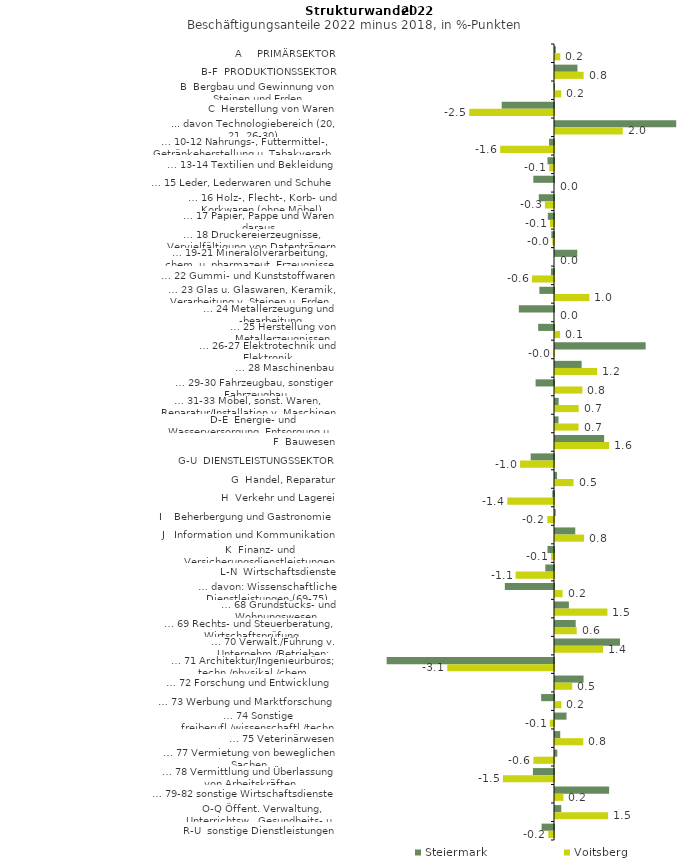
| Category | Steiermark | Voitsberg |
|---|---|---|
| A     PRIMÄRSEKTOR | 0.025 | 0.153 |
| B-F  PRODUKTIONSSEKTOR | 0.65 | 0.83 |
| B  Bergbau und Gewinnung von Steinen und Erden | -0.011 | 0.182 |
| C  Herstellung von Waren | -1.516 | -2.456 |
| ... davon Technologiebereich (20, 21, 26-30) | 3.513 | 1.964 |
| … 10-12 Nahrungs-, Futtermittel-, Getränkeherstellung u. Tabakverarb. | -0.143 | -1.558 |
| … 13-14 Textilien und Bekleidung | -0.189 | -0.138 |
| … 15 Leder, Lederwaren und Schuhe | -0.6 | 0 |
| … 16 Holz-, Flecht-, Korb- und Korkwaren (ohne Möbel)  | -0.44 | -0.264 |
| … 17 Papier, Pappe und Waren daraus  | -0.178 | -0.116 |
| … 18 Druckereierzeugnisse, Vervielfältigung von Datenträgern | -0.077 | -0.048 |
| … 19-21 Mineralölverarbeitung, chem. u. pharmazeut. Erzeugnisse | 0.646 | 0 |
| … 22 Gummi- und Kunststoffwaren | -0.089 | -0.637 |
| … 23 Glas u. Glaswaren, Keramik, Verarbeitung v. Steinen u. Erden  | -0.424 | 0.997 |
| … 24 Metallerzeugung und -bearbeitung | -1.019 | 0 |
| … 25 Herstellung von Metallerzeugnissen  | -0.459 | 0.149 |
| … 26-27 Elektrotechnik und Elektronik | 2.628 | -0.017 |
| … 28 Maschinenbau | 0.773 | 1.219 |
| … 29-30 Fahrzeugbau, sonstiger Fahrzeugbau | -0.534 | 0.795 |
| … 31-33 Möbel, sonst. Waren, Reparatur/Installation v. Maschinen | 0.106 | 0.688 |
| D-E  Energie- und Wasserversorgung, Entsorgung u. Rückgewinnung | 0.102 | 0.683 |
| F  Bauwesen | 1.424 | 1.57 |
| G-U  DIENSTLEISTUNGSSEKTOR | -0.676 | -0.983 |
| G  Handel, Reparatur | 0.059 | 0.539 |
| H  Verkehr und Lagerei | -0.05 | -1.353 |
| I    Beherbergung und Gastronomie | 0.02 | -0.195 |
| J   Information und Kommunikation | 0.588 | 0.843 |
| K  Finanz- und Versicherungsdienstleistungen | -0.188 | -0.082 |
| L-N  Wirtschaftsdienste | -0.252 | -1.112 |
| … davon: Wissenschaftliche Dienstleistungen (69-75) | -1.425 | 0.219 |
| … 68 Grundstücks- und Wohnungswesen  | 0.402 | 1.519 |
| … 69 Rechts- und Steuerberatung, Wirtschaftsprüfung | 0.6 | 0.628 |
| … 70 Verwalt./Führung v. Unternehm./Betrieben; Unternehmensberat. | 1.883 | 1.393 |
| … 71 Architektur/Ingenieurbüros; techn./physikal./chem. Untersuchung | -4.85 | -3.094 |
| … 72 Forschung und Entwicklung  | 0.828 | 0.5 |
| … 73 Werbung und Marktforschung | -0.372 | 0.188 |
| … 74 Sonstige freiberufl./wissenschaftl./techn. Tätigkeiten | 0.334 | -0.122 |
| … 75 Veterinärwesen | 0.152 | 0.82 |
| … 77 Vermietung von beweglichen Sachen  | 0.067 | -0.598 |
| … 78 Vermittlung und Überlassung von Arbeitskräften | -0.611 | -1.48 |
| … 79-82 sonstige Wirtschaftsdienste | 1.569 | 0.245 |
| O-Q Öffent. Verwaltung, Unterrichtsw., Gesundheits- u. Sozialwesen | 0.182 | 1.538 |
| R-U  sonstige Dienstleistungen | -0.359 | -0.166 |